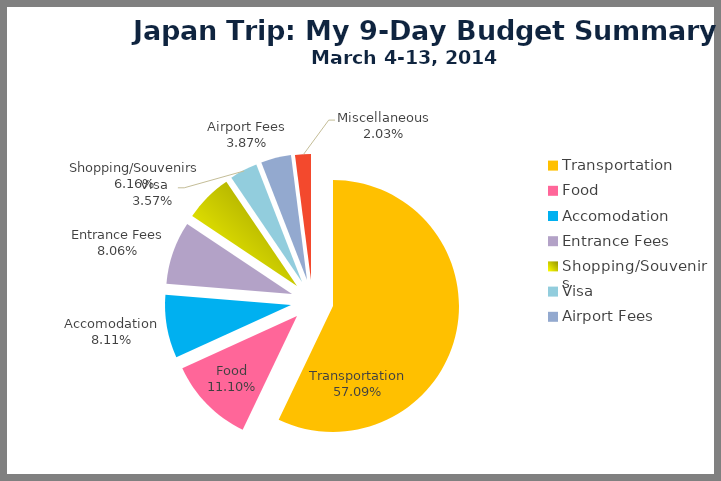
| Category | in PHP |
|---|---|
| Transportation | 31978.19 |
| Food | 6219.238 |
| Accomodation | 4540.56 |
| Entrance Fees | 4512.54 |
| Shopping/Souvenirs | 3450.84 |
| Visa | 2000 |
| Airport Fees | 2170 |
| Miscellaneous | 1137.615 |